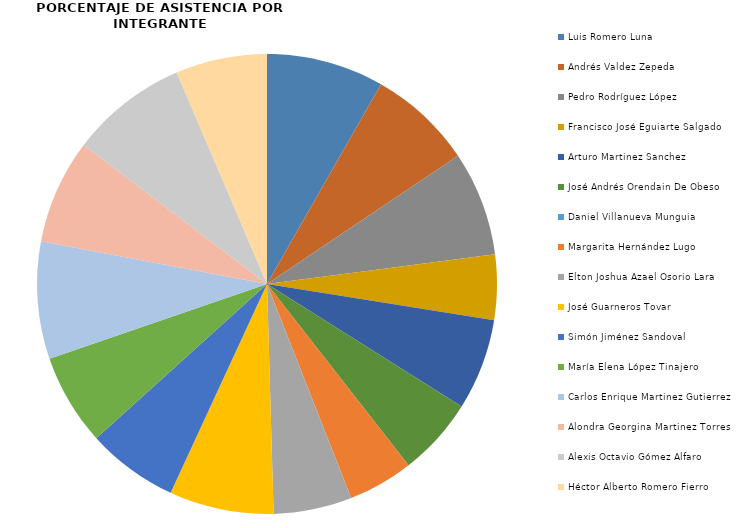
| Category | Series 0 |
|---|---|
| Luis Romero Luna | 9 |
| Andrés Valdez Zepeda | 8 |
| Pedro Rodríguez López | 8 |
| Francisco José Eguiarte Salgado | 5 |
| Arturo Martinez Sanchez  | 7 |
| José Andrés Orendain De Obeso | 6 |
| Daniel Villanueva Munguia | 0 |
| Margarita Hernández Lugo | 5 |
| Elton Joshua Azael Osorio Lara | 6 |
| José Guarneros Tovar | 8 |
| Simón Jiménez Sandoval | 7 |
| María Elena López Tinajero | 7 |
| Carlos Enrique Martinez Gutierrez | 9 |
| Alondra Georgina Martinez Torres | 8 |
| Alexis Octavio Gómez Alfaro | 9 |
| Héctor Alberto Romero Fierro | 7 |